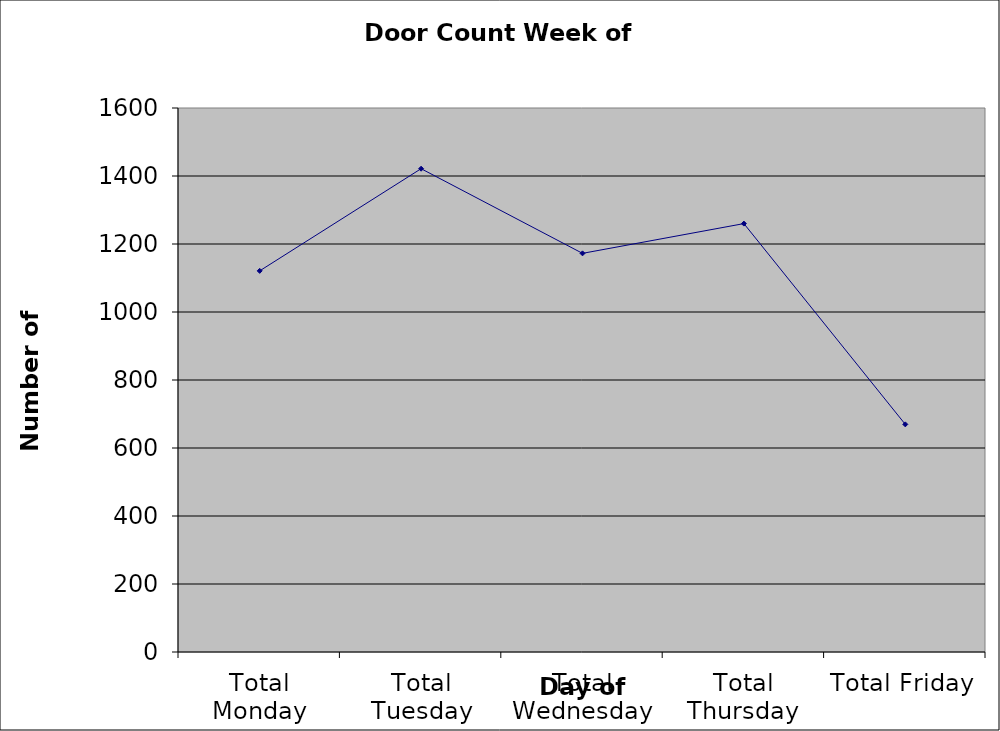
| Category | Series 0 |
|---|---|
| Total Monday | 1121 |
| Total Tuesday | 1421.5 |
| Total Wednesday | 1172.5 |
| Total Thursday | 1260 |
| Total Friday | 669.5 |